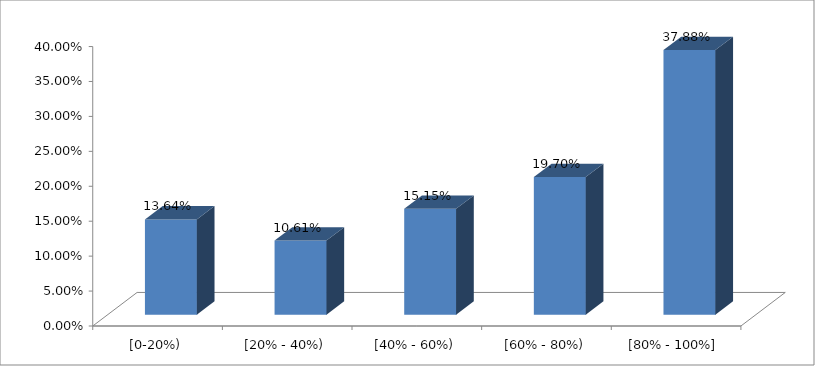
| Category | Series 0 |
|---|---|
| [0-20%) | 0.136 |
| [20% - 40%) | 0.106 |
| [40% - 60%) | 0.152 |
| [60% - 80%) | 0.197 |
| [80% - 100%] | 0.379 |